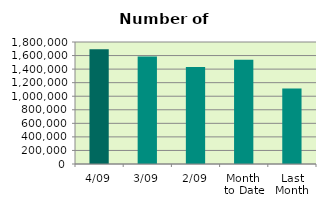
| Category | Series 0 |
|---|---|
| 4/09 | 1691190 |
| 3/09 | 1587182 |
| 2/09 | 1432594 |
| Month 
to Date | 1539684.5 |
| Last
Month | 1113186.286 |